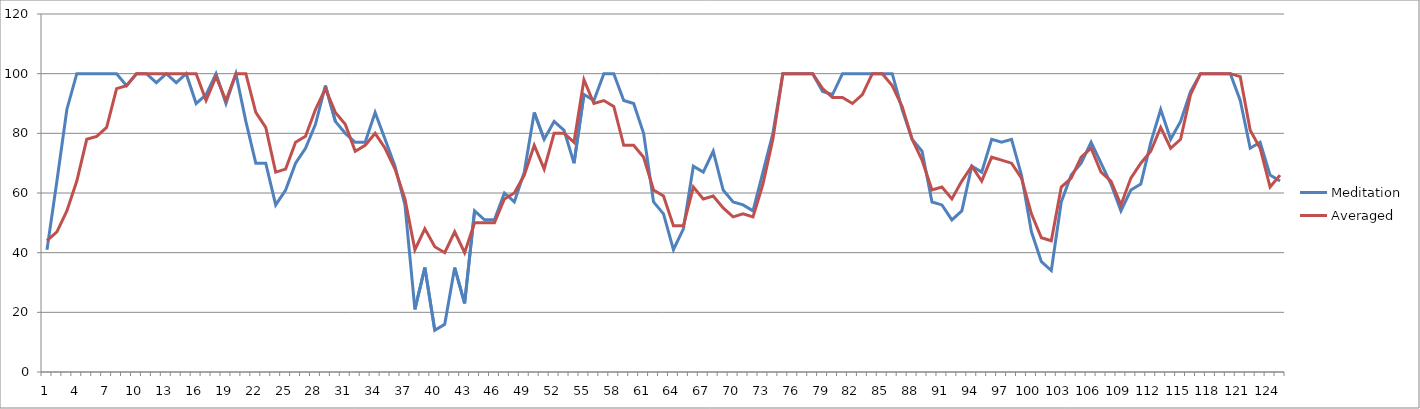
| Category | Meditation | Averaged |
|---|---|---|
| 0 | 41 | 44 |
| 1 | 64 | 47 |
| 2 | 88 | 54 |
| 3 | 100 | 64 |
| 4 | 100 | 78 |
| 5 | 100 | 79 |
| 6 | 100 | 82 |
| 7 | 100 | 95 |
| 8 | 96 | 96 |
| 9 | 100 | 100 |
| 10 | 100 | 100 |
| 11 | 97 | 100 |
| 12 | 100 | 100 |
| 13 | 97 | 100 |
| 14 | 100 | 100 |
| 15 | 90 | 100 |
| 16 | 93 | 91 |
| 17 | 100 | 99 |
| 18 | 90 | 91 |
| 19 | 100 | 100 |
| 20 | 84 | 100 |
| 21 | 70 | 87 |
| 22 | 70 | 82 |
| 23 | 56 | 67 |
| 24 | 61 | 68 |
| 25 | 70 | 77 |
| 26 | 75 | 79 |
| 27 | 83 | 88 |
| 28 | 96 | 95 |
| 29 | 84 | 87 |
| 30 | 80 | 83 |
| 31 | 77 | 74 |
| 32 | 77 | 76 |
| 33 | 87 | 80 |
| 34 | 78 | 75 |
| 35 | 69 | 68 |
| 36 | 56 | 58 |
| 37 | 21 | 41 |
| 38 | 35 | 48 |
| 39 | 14 | 42 |
| 40 | 16 | 40 |
| 41 | 35 | 47 |
| 42 | 23 | 40 |
| 43 | 54 | 50 |
| 44 | 51 | 50 |
| 45 | 51 | 50 |
| 46 | 60 | 58 |
| 47 | 57 | 60 |
| 48 | 67 | 66 |
| 49 | 87 | 76 |
| 50 | 78 | 68 |
| 51 | 84 | 80 |
| 52 | 81 | 80 |
| 53 | 70 | 77 |
| 54 | 93 | 98 |
| 55 | 91 | 90 |
| 56 | 100 | 91 |
| 57 | 100 | 89 |
| 58 | 91 | 76 |
| 59 | 90 | 76 |
| 60 | 80 | 72 |
| 61 | 57 | 61 |
| 62 | 53 | 59 |
| 63 | 41 | 49 |
| 64 | 48 | 49 |
| 65 | 69 | 62 |
| 66 | 67 | 58 |
| 67 | 74 | 59 |
| 68 | 61 | 55 |
| 69 | 57 | 52 |
| 70 | 56 | 53 |
| 71 | 54 | 52 |
| 72 | 67 | 63 |
| 73 | 80 | 78 |
| 74 | 100 | 100 |
| 75 | 100 | 100 |
| 76 | 100 | 100 |
| 77 | 100 | 100 |
| 78 | 94 | 95 |
| 79 | 93 | 92 |
| 80 | 100 | 92 |
| 81 | 100 | 90 |
| 82 | 100 | 93 |
| 83 | 100 | 100 |
| 84 | 100 | 100 |
| 85 | 100 | 96 |
| 86 | 88 | 89 |
| 87 | 78 | 78 |
| 88 | 74 | 71 |
| 89 | 57 | 61 |
| 90 | 56 | 62 |
| 91 | 51 | 58 |
| 92 | 54 | 64 |
| 93 | 69 | 69 |
| 94 | 67 | 64 |
| 95 | 78 | 72 |
| 96 | 77 | 71 |
| 97 | 78 | 70 |
| 98 | 66 | 65 |
| 99 | 47 | 53 |
| 100 | 37 | 45 |
| 101 | 34 | 44 |
| 102 | 57 | 62 |
| 103 | 66 | 65 |
| 104 | 70 | 72 |
| 105 | 77 | 75 |
| 106 | 70 | 67 |
| 107 | 63 | 64 |
| 108 | 54 | 56 |
| 109 | 61 | 65 |
| 110 | 63 | 70 |
| 111 | 77 | 74 |
| 112 | 88 | 82 |
| 113 | 78 | 75 |
| 114 | 84 | 78 |
| 115 | 94 | 93 |
| 116 | 100 | 100 |
| 117 | 100 | 100 |
| 118 | 100 | 100 |
| 119 | 100 | 100 |
| 120 | 91 | 99 |
| 121 | 75 | 81 |
| 122 | 77 | 75 |
| 123 | 66 | 62 |
| 124 | 64 | 66 |